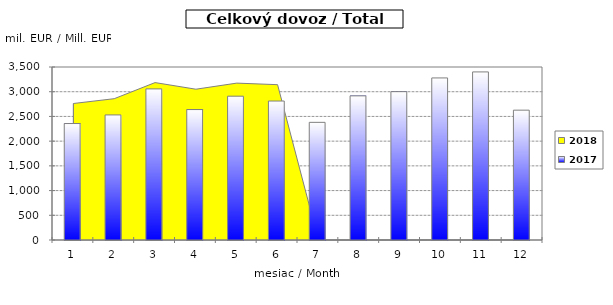
| Category | 2017 |
|---|---|
| 0 | 2356.044 |
| 1 | 2530.315 |
| 2 | 3056.938 |
| 3 | 2638.713 |
| 4 | 2909.401 |
| 5 | 2811.337 |
| 6 | 2380.29 |
| 7 | 2916.345 |
| 8 | 3001.059 |
| 9 | 3278.95 |
| 10 | 3400.497 |
| 11 | 2626.741 |